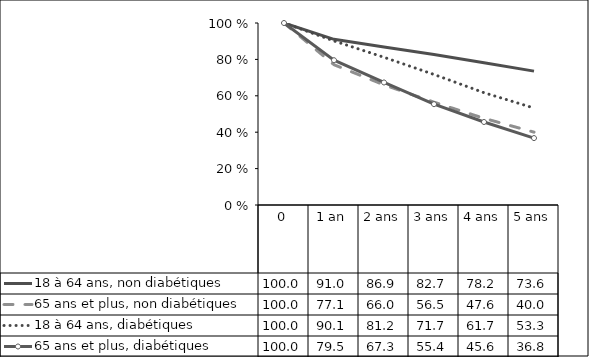
| Category | 18 à 64 ans, non diabétiques | 65 ans et plus, non diabétiques    | 18 à 64 ans, diabétiques | 65 ans et plus, diabétiques |
|---|---|---|---|---|
| 0 | 100 | 100 | 100 | 100 |
| 1 an | 91.034 | 77.082 | 90.15 | 79.544 |
| 2 ans | 86.862 | 66 | 81.163 | 67.328 |
| 3 ans | 82.655 | 56.493 | 71.715 | 55.41 |
| 4 ans | 78.201 | 47.621 | 61.707 | 45.611 |
| 5 ans | 73.563 | 40.032 | 53.267 | 36.77 |